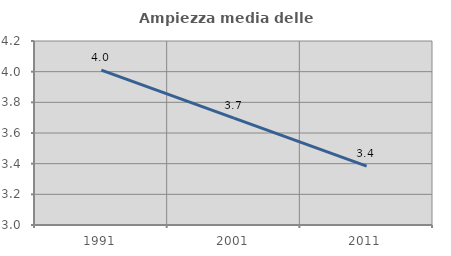
| Category | Ampiezza media delle famiglie |
|---|---|
| 1991.0 | 4.01 |
| 2001.0 | 3.697 |
| 2011.0 | 3.384 |